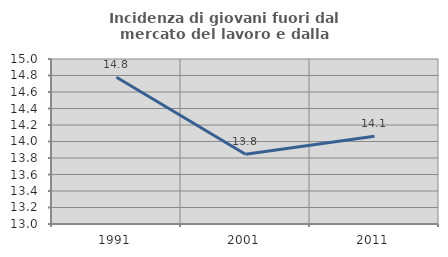
| Category | Incidenza di giovani fuori dal mercato del lavoro e dalla formazione  |
|---|---|
| 1991.0 | 14.778 |
| 2001.0 | 13.846 |
| 2011.0 | 14.062 |